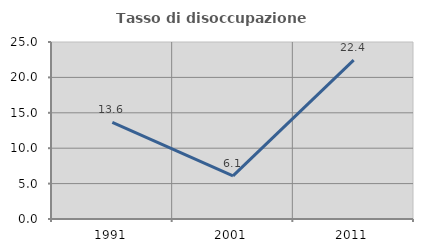
| Category | Tasso di disoccupazione giovanile  |
|---|---|
| 1991.0 | 13.636 |
| 2001.0 | 6.087 |
| 2011.0 | 22.43 |